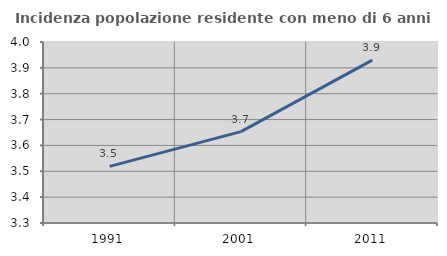
| Category | Incidenza popolazione residente con meno di 6 anni |
|---|---|
| 1991.0 | 3.519 |
| 2001.0 | 3.654 |
| 2011.0 | 3.93 |